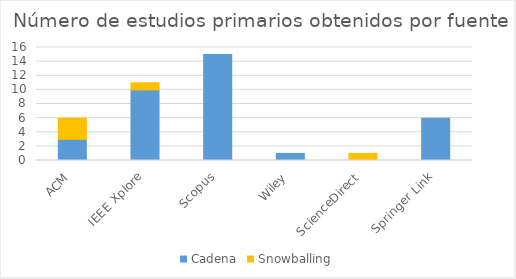
| Category | Cadena | Snowballing |
|---|---|---|
| ACM | 3 | 3 |
| IEEE Xplore | 10 | 1 |
| Scopus | 15 | 0 |
| Wiley | 1 | 0 |
| ScienceDirect | 0 | 1 |
| Springer Link | 6 | 0 |